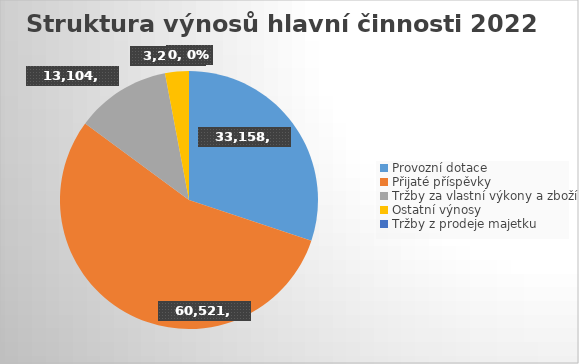
| Category | Series 0 |
|---|---|
| Provozní dotace | 33158 |
| Přijaté příspěvky | 60521 |
| Tržby za vlastní výkony a zboží | 13104 |
| Ostatní výnosy | 3285 |
| Tržby z prodeje majetku | 0 |